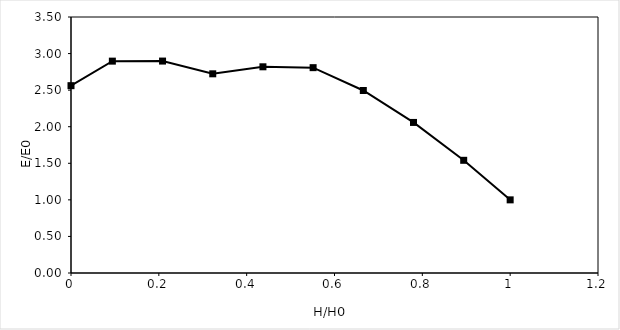
| Category | Head (feet) |
|---|---|
| 1.0 | 1 |
| 0.8941798941798942 | 1.541 |
| 0.7798941798941799 | 2.058 |
| 0.6656084656084655 | 2.495 |
| 0.5513227513227513 | 2.807 |
| 0.437037037037037 | 2.819 |
| 0.32275132275132273 | 2.723 |
| 0.20846560846560844 | 2.897 |
| 0.09417989417989416 | 2.897 |
| 0.0 | 2.561 |